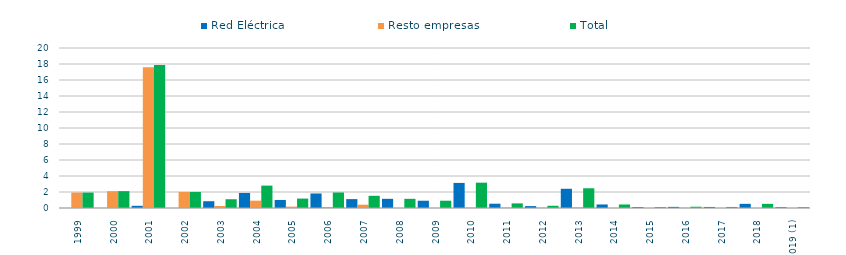
| Category | Red Eléctrica | Resto empresas | Total |
|---|---|---|---|
| 1999 | 0.001 | 1.926 | 1.927 |
| 2000 | 0.004 | 2.103 | 2.107 |
| 2001 | 0.274 | 17.594 | 17.868 |
| 2002 | 0 | 2.006 | 2.006 |
| 2003 | 0.846 | 0.249 | 1.095 |
| 2004 | 1.882 | 0.916 | 2.798 |
| 2005 | 1.006 | 0.17 | 1.176 |
| 2006 | 1.817 | 0.122 | 1.939 |
| 2007 | 1.111 | 0.412 | 1.523 |
| 2008 | 1.147 | 0 | 1.147 |
| 2009 | 0.91 | 0 | 0.91 |
| 2010 | 3.135 | 0.032 | 3.167 |
| 2011 | 0.535 | 0.042 | 0.577 |
| 2012 | 0.238 | 0.04 | 0.278 |
| 2013 | 2.403 | 0.064 | 2.467 |
| 2014 | 0.441 | 0 | 0.441 |
| 2015 | 0.112 | 0 | 0.112 |
| 2016 | 0.14 | 0.02 | 0.16 |
| 2017 | 0.13 | 0 | 0.13 |
| 2018 | 0.52 | 0 | 0.52 |
| 2019 (1) | 0.1 | 0.002 | 0.1 |